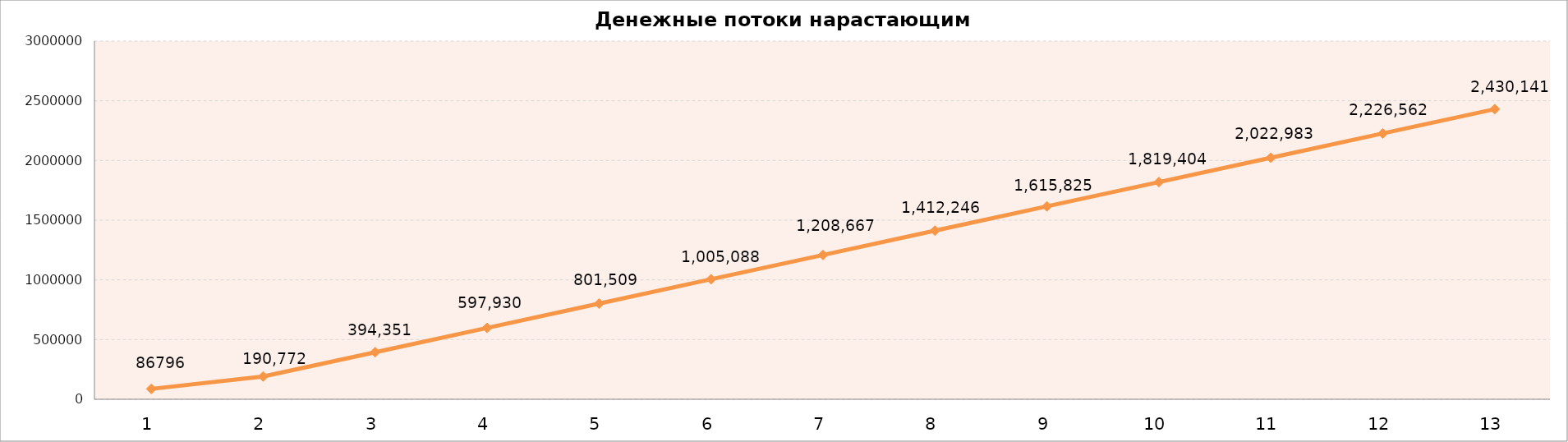
| Category | (+) Инвестиционные доходы |
|---|---|
| 0 | 86796 |
| 1 | 190772 |
| 2 | 394351 |
| 3 | 597930 |
| 4 | 801509 |
| 5 | 1005088 |
| 6 | 1208667 |
| 7 | 1412246 |
| 8 | 1615825 |
| 9 | 1819404 |
| 10 | 2022983 |
| 11 | 2226562 |
| 12 | 2430141 |